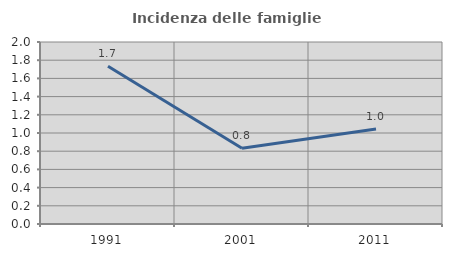
| Category | Incidenza delle famiglie numerose |
|---|---|
| 1991.0 | 1.734 |
| 2001.0 | 0.831 |
| 2011.0 | 1.043 |